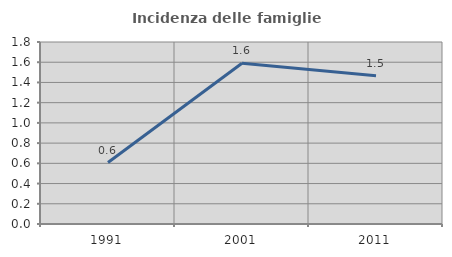
| Category | Incidenza delle famiglie numerose |
|---|---|
| 1991.0 | 0.608 |
| 2001.0 | 1.589 |
| 2011.0 | 1.466 |